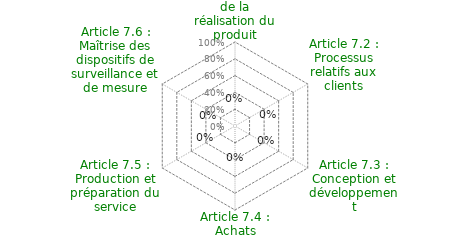
| Category | Article 7 : Réalisation du produit |
|---|---|
| Article 7.1 : Planification de la réalisation du produit | 0 |
| Article 7.2 : Processus relatifs aux clients | 0 |
| Article 7.3 : Conception et développement | 0 |
| Article 7.4 : Achats | 0 |
| Article 7.5 : Production et préparation du service | 0 |
| Article 7.6 : Maîtrise des dispositifs de surveillance et de mesure | 0 |